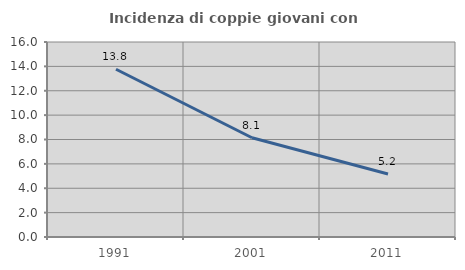
| Category | Incidenza di coppie giovani con figli |
|---|---|
| 1991.0 | 13.766 |
| 2001.0 | 8.142 |
| 2011.0 | 5.165 |